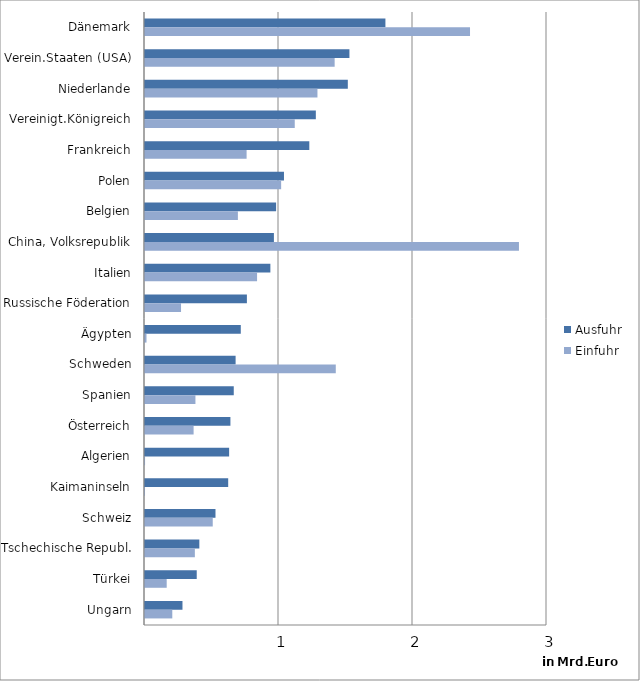
| Category | Ausfuhr | Einfuhr |
|---|---|---|
| Dänemark | 1.794 | 2.425 |
| Verein.Staaten (USA) | 1.526 | 1.415 |
| Niederlande | 1.514 | 1.287 |
| Vereinigt.Königreich | 1.275 | 1.118 |
| Frankreich | 1.226 | 0.758 |
| Polen | 1.037 | 1.016 |
| Belgien | 0.978 | 0.693 |
| China, Volksrepublik | 0.962 | 2.791 |
| Italien | 0.936 | 0.836 |
| Russische Föderation | 0.76 | 0.269 |
| Ägypten | 0.715 | 0.011 |
| Schweden | 0.676 | 1.424 |
| Spanien | 0.662 | 0.376 |
| Österreich | 0.637 | 0.363 |
| Algerien | 0.628 | 0 |
| Kaimaninseln | 0.621 | 0 |
| Schweiz | 0.526 | 0.506 |
| Tschechische Republ. | 0.405 | 0.372 |
| Türkei | 0.386 | 0.162 |
| Ungarn | 0.28 | 0.204 |